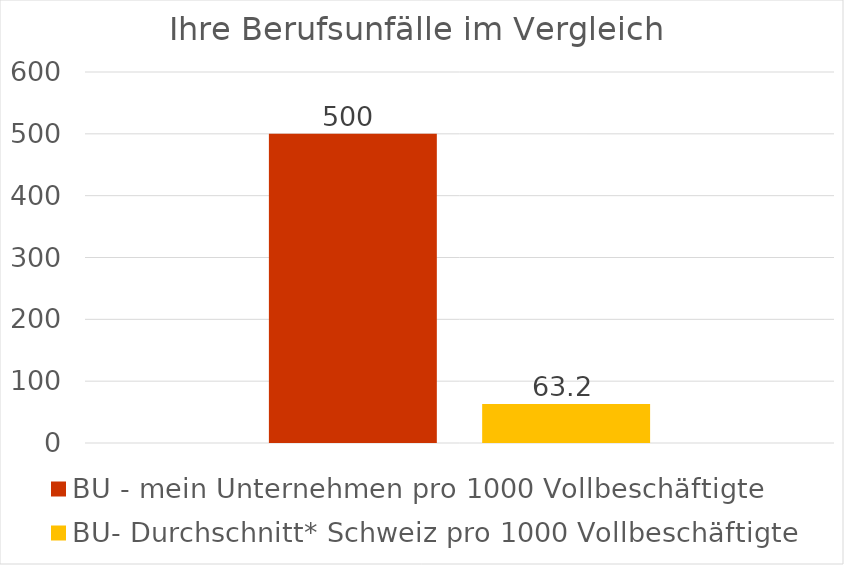
| Category | BU - mein Unternehmen pro 1000 Vollbeschäftigte | BU- Durchschnitt* Schweiz pro 1000 Vollbeschäftigte |
|---|---|---|
| Fallrisiko (Umrechung auf 1000 Vollbeschäftigte) | 500 | 63.2 |